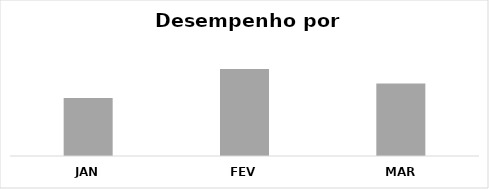
| Category | Europa |
|---|---|
| JAN | 100 |
| FEV | 150 |
| MAR | 125 |